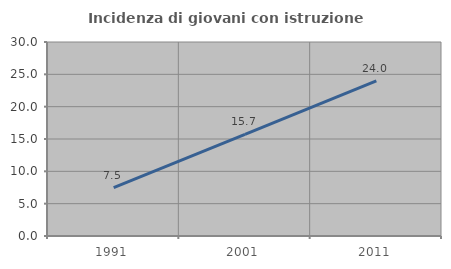
| Category | Incidenza di giovani con istruzione universitaria |
|---|---|
| 1991.0 | 7.483 |
| 2001.0 | 15.7 |
| 2011.0 | 23.989 |